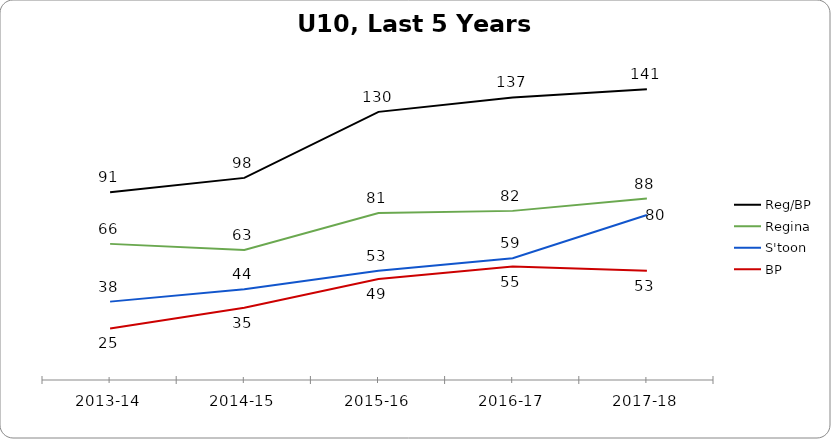
| Category | Reg/BP | Regina | S'toon | BP |
|---|---|---|---|---|
| 2013-14 | 91 | 66 | 38 | 25 |
| 2014-15 | 98 | 63 | 44 | 35 |
| 2015-16 | 130 | 81 | 53 | 49 |
| 2016-17 | 137 | 82 | 59 | 55 |
| 2017-18 | 141 | 88 | 80 | 53 |